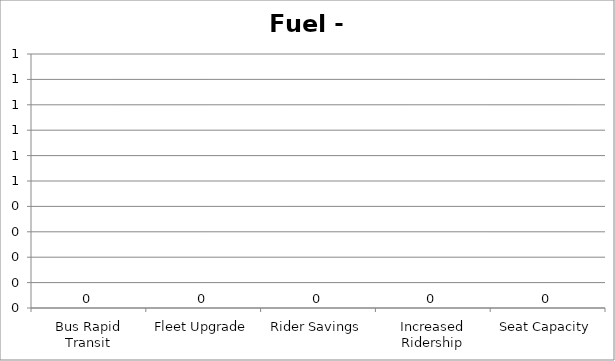
| Category | Fuel - GGE |
|---|---|
| Bus Rapid Transit | 0 |
| Fleet Upgrade | 0 |
| Rider Savings | 0 |
| Increased Ridership | 0 |
| Seat Capacity | 0 |